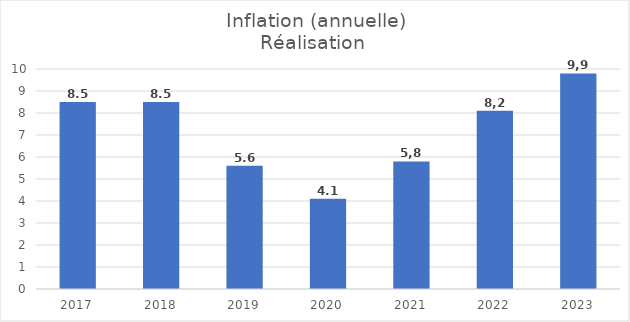
| Category |  Inflation  |
|---|---|
| 2017.0 | 8.5 |
| 2018.0 | 8.5 |
| 2019.0 | 5.6 |
| 2020.0 | 4.1 |
| 2021.0 | 5.8 |
| 2022.0 | 8.1 |
| 2023.0 | 9.8 |